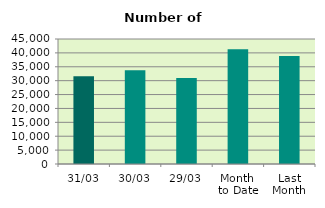
| Category | Series 0 |
|---|---|
| 31/03 | 31614 |
| 30/03 | 33736 |
| 29/03 | 30944 |
| Month 
to Date | 41301.217 |
| Last
Month | 38877.2 |